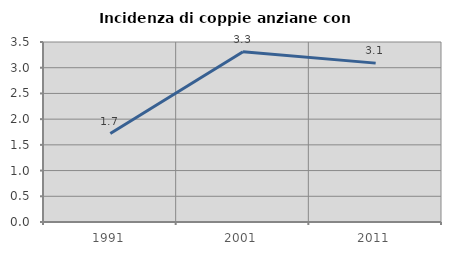
| Category | Incidenza di coppie anziane con figli |
|---|---|
| 1991.0 | 1.719 |
| 2001.0 | 3.31 |
| 2011.0 | 3.089 |